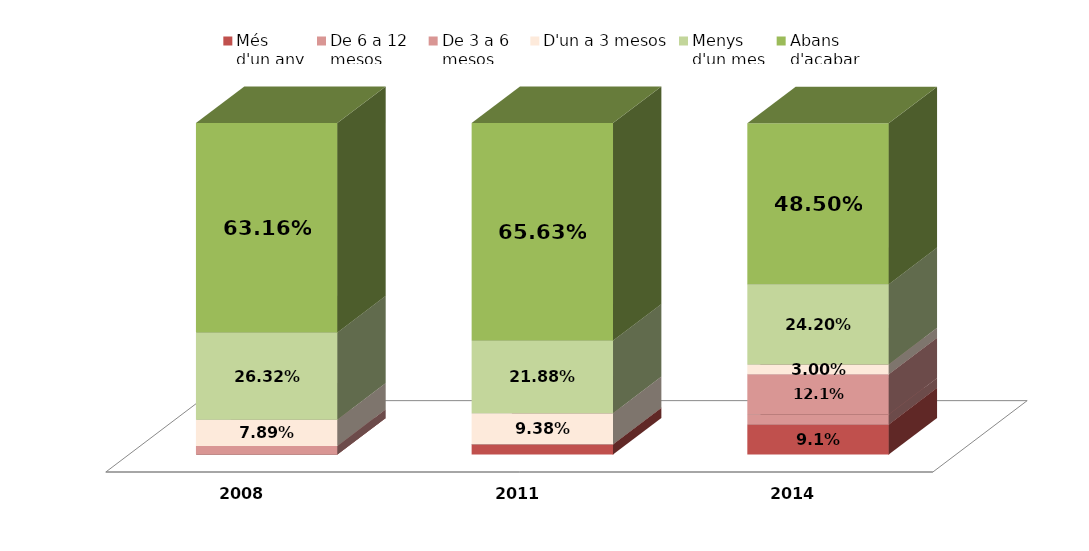
| Category | Més
d'un any | De 6 a 12
mesos | De 3 a 6
mesos | D'un a 3 mesos | Menys
d'un mes | Abans
d'acabar |
|---|---|---|---|---|---|---|
| 2008.0 | 0 | 0 | 0.026 | 0.079 | 0.263 | 0.632 |
| 2011.0 | 0.031 | 0 | 0 | 0.094 | 0.219 | 0.656 |
| 2014.0 | 0.091 | 0.03 | 0.121 | 0.03 | 0.242 | 0.485 |